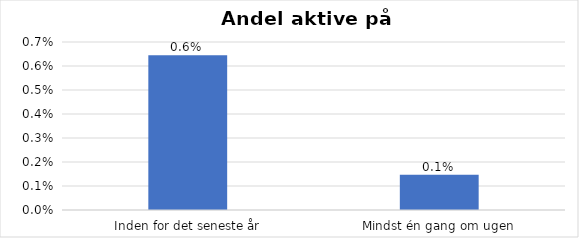
| Category | % |
|---|---|
| Inden for det seneste år | 0.006 |
| Mindst én gang om ugen | 0.001 |